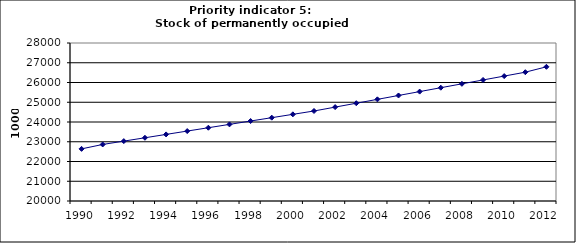
| Category | Stock of permanently occupied dwellings, 1000 |
|---|---|
| 1990 | 22639.315 |
| 1991 | 22862.734 |
| 1992 | 23032.211 |
| 1993 | 23201.689 |
| 1994 | 23371.166 |
| 1995 | 23540.644 |
| 1996 | 23710.121 |
| 1997 | 23879.598 |
| 1998 | 24049.076 |
| 1999 | 24218.553 |
| 2000 | 24388.031 |
| 2001 | 24557.508 |
| 2002 | 24753.895 |
| 2003 | 24950.283 |
| 2004 | 25146.67 |
| 2005 | 25343.057 |
| 2006 | 25539.444 |
| 2007 | 25735.832 |
| 2008 | 25932.219 |
| 2009 | 26128.606 |
| 2010 | 26324.994 |
| 2011 | 26521.381 |
| 2012 | 26794.432 |